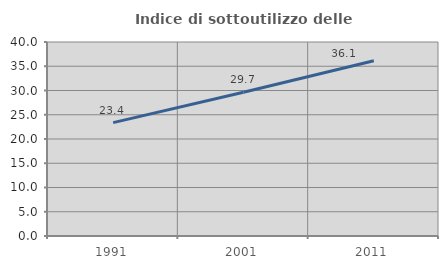
| Category | Indice di sottoutilizzo delle abitazioni  |
|---|---|
| 1991.0 | 23.38 |
| 2001.0 | 29.654 |
| 2011.0 | 36.12 |